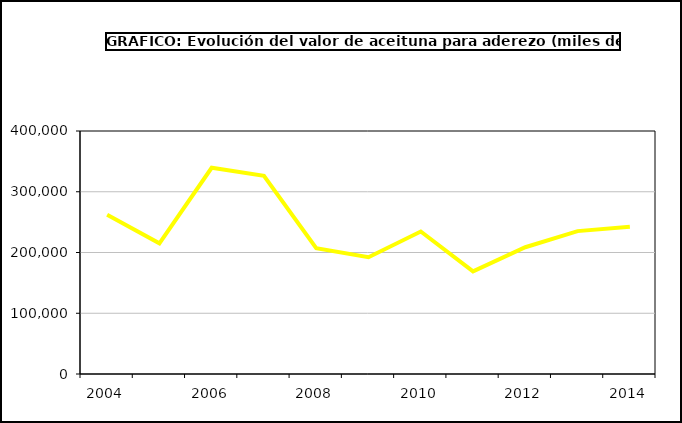
| Category | producción |
|---|---|
| 2004.0 | 262172.03 |
| 2005.0 | 215036.764 |
| 2006.0 | 339502.417 |
| 2007.0 | 326124.5 |
| 2008.0 | 207000.08 |
| 2009.0 | 192222.48 |
| 2010.0 | 234593.447 |
| 2011.0 | 168933.753 |
| 2012.0 | 208668.687 |
| 2013.0 | 235213.576 |
| 2014.0 | 242272.525 |